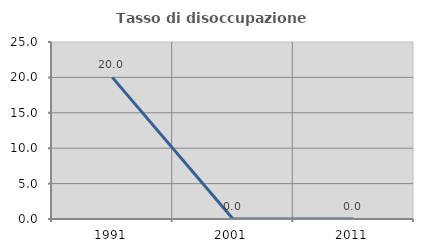
| Category | Tasso di disoccupazione giovanile  |
|---|---|
| 1991.0 | 20 |
| 2001.0 | 0 |
| 2011.0 | 0 |